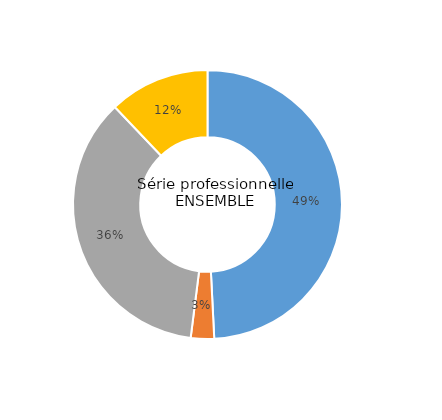
| Category | Series 0 |
|---|---|
| ... ayant validé la maîtrise du socle, et obtenu une moyenne aux épreuves terminales supérieure ou égale à 10/20 | 49.2 |
| ... n'ayant pas validé la maîtrise du socle, et obtenu une moyenne aux épreuves terminales supérieure ou égale à 10/20 | 2.8 |
| ... ayant validé la maîtrise du socle, et obtenu une moyenne aux épreuves terminales inférieure à 10/20 | 35.9 |
| ... n'ayant pas validé la maîtrise du socle, et obtenu une moyenne aux épreuves terminales inférieure à 10/20 | 12.1 |